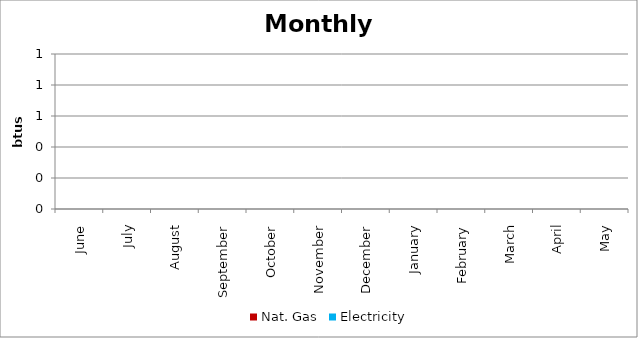
| Category | Nat. Gas | Electricity |
|---|---|---|
| June | 0 | 0 |
| July | 0 | 0 |
| August | 0 | 0 |
| September | 0 | 0 |
| October | 0 | 0 |
| November | 0 | 0 |
| December | 0 | 0 |
| January | 0 | 0 |
| February | 0 | 0 |
| March | 0 | 0 |
| April | 0 | 0 |
| May | 0 | 0 |